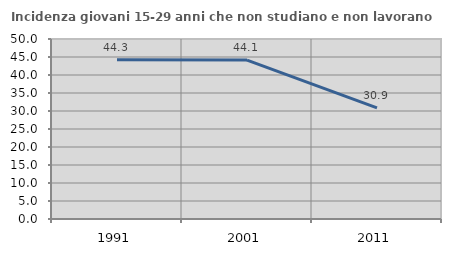
| Category | Incidenza giovani 15-29 anni che non studiano e non lavorano  |
|---|---|
| 1991.0 | 44.262 |
| 2001.0 | 44.134 |
| 2011.0 | 30.851 |